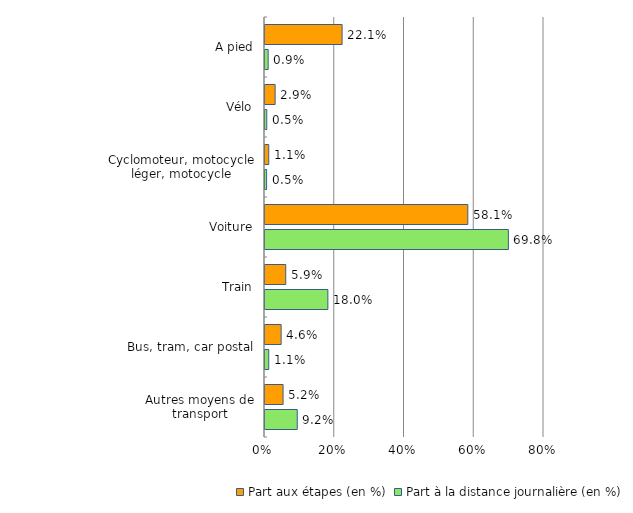
| Category | Part aux étapes (en %) | Part à la distance journalière (en %) |
|---|---|---|
| A pied | 22.108 | 0.913 |
| Vélo | 2.905 | 0.504 |
| Cyclomoteur, motocycle léger, motocycle | 1.077 | 0.454 |
| Voiture | 58.15 | 69.786 |
| Train | 5.949 | 18.026 |
| Bus, tram, car postal | 4.629 | 1.074 |
| Autres moyens de transport | 5.181 | 9.243 |